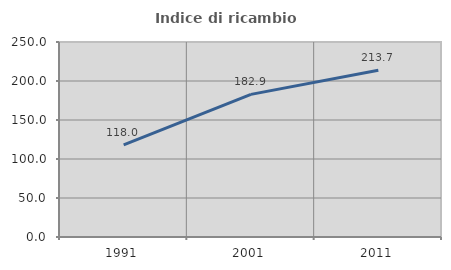
| Category | Indice di ricambio occupazionale  |
|---|---|
| 1991.0 | 118.045 |
| 2001.0 | 182.857 |
| 2011.0 | 213.725 |